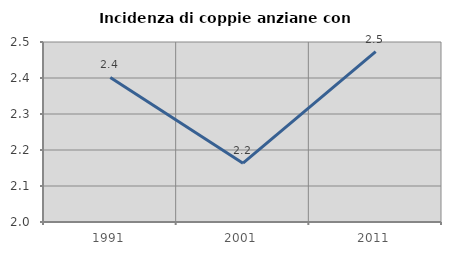
| Category | Incidenza di coppie anziane con figli |
|---|---|
| 1991.0 | 2.402 |
| 2001.0 | 2.163 |
| 2011.0 | 2.473 |